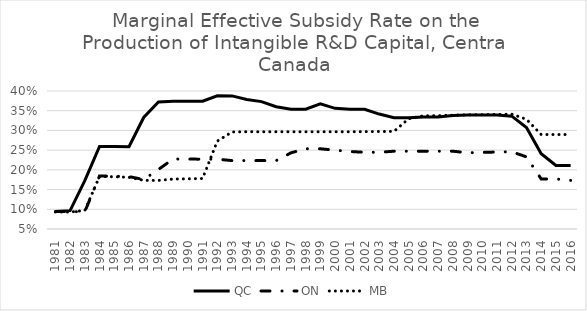
| Category | QC | ON | MB |
|---|---|---|---|
| 1981.0 | 0.094 | 0.094 | 0.093 |
| 1982.0 | 0.097 | 0.094 | 0.093 |
| 1983.0 | 0.173 | 0.094 | 0.097 |
| 1984.0 | 0.259 | 0.184 | 0.183 |
| 1985.0 | 0.259 | 0.184 | 0.182 |
| 1986.0 | 0.259 | 0.183 | 0.181 |
| 1987.0 | 0.333 | 0.175 | 0.173 |
| 1988.0 | 0.372 | 0.201 | 0.173 |
| 1989.0 | 0.374 | 0.228 | 0.177 |
| 1990.0 | 0.374 | 0.227 | 0.177 |
| 1991.0 | 0.374 | 0.227 | 0.178 |
| 1992.0 | 0.388 | 0.227 | 0.273 |
| 1993.0 | 0.388 | 0.224 | 0.296 |
| 1994.0 | 0.378 | 0.223 | 0.297 |
| 1995.0 | 0.373 | 0.223 | 0.297 |
| 1996.0 | 0.36 | 0.223 | 0.297 |
| 1997.0 | 0.354 | 0.243 | 0.297 |
| 1998.0 | 0.354 | 0.253 | 0.297 |
| 1999.0 | 0.367 | 0.253 | 0.297 |
| 2000.0 | 0.356 | 0.25 | 0.297 |
| 2001.0 | 0.353 | 0.247 | 0.297 |
| 2002.0 | 0.353 | 0.245 | 0.297 |
| 2003.0 | 0.342 | 0.245 | 0.297 |
| 2004.0 | 0.332 | 0.247 | 0.298 |
| 2005.0 | 0.332 | 0.247 | 0.33 |
| 2006.0 | 0.334 | 0.247 | 0.337 |
| 2007.0 | 0.334 | 0.247 | 0.337 |
| 2008.0 | 0.338 | 0.247 | 0.339 |
| 2009.0 | 0.339 | 0.243 | 0.339 |
| 2010.0 | 0.339 | 0.244 | 0.34 |
| 2011.0 | 0.339 | 0.245 | 0.341 |
| 2012.0 | 0.336 | 0.246 | 0.341 |
| 2013.0 | 0.307 | 0.233 | 0.328 |
| 2014.0 | 0.241 | 0.177 | 0.29 |
| 2015.0 | 0.211 | 0.177 | 0.29 |
| 2016.0 | 0.211 | 0.173 | 0.29 |